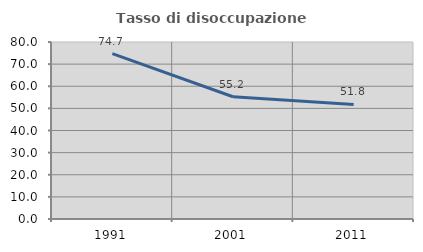
| Category | Tasso di disoccupazione giovanile  |
|---|---|
| 1991.0 | 74.729 |
| 2001.0 | 55.248 |
| 2011.0 | 51.805 |